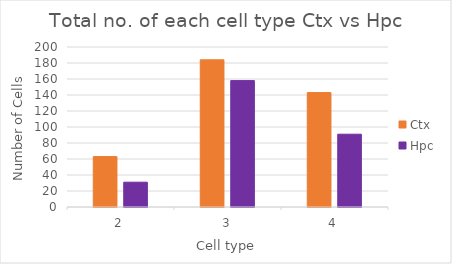
| Category | Ctx | Hpc |
|---|---|---|
| 2.0 | 63 | 31 |
| 3.0 | 184 | 158 |
| 4.0 | 143 | 91 |